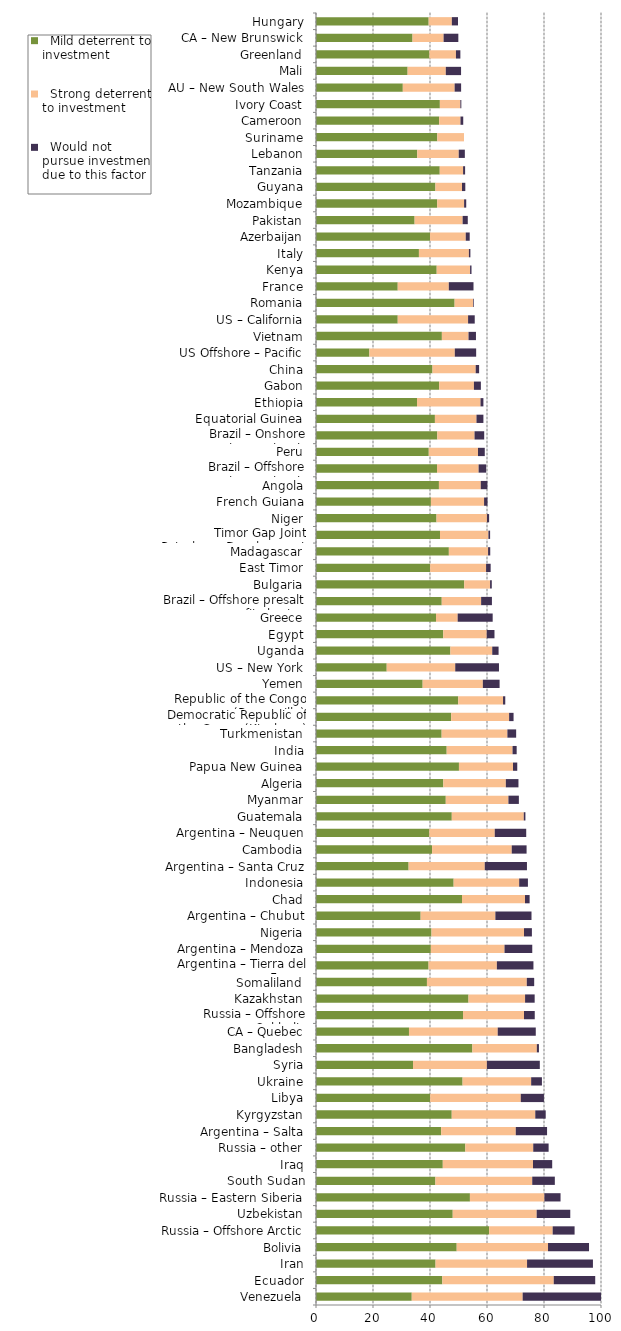
| Category |   Mild deterrent to investment |   Strong deterrent to investment |   Would not pursue investment due to this factor |
|---|---|---|---|
| Venezuela | 33.599 | 38.911 | 27.49 |
| Ecuador | 44.326 | 39.098 | 14.548 |
| Iran | 41.951 | 32.105 | 23.116 |
| Bolivia | 49.37 | 32.041 | 14.386 |
| Russia – Offshore Arctic | 60.746 | 22.299 | 7.689 |
| Uzbekistan | 47.976 | 29.459 | 11.783 |
| Russia – Eastern Siberia | 54.009 | 26.133 | 5.662 |
| South Sudan | 41.9 | 33.973 | 7.927 |
| Iraq | 44.489 | 31.651 | 6.737 |
| Russia – other | 52.391 | 23.834 | 5.396 |
| Argentina – Salta | 43.916 | 26.18 | 10.979 |
| Kyrgyzstan | 47.629 | 29.31 | 3.664 |
| Libya | 40.067 | 31.782 | 8.134 |
| Ukraine | 51.432 | 24.064 | 3.775 |
| Syria | 34.044 | 25.92 | 18.569 |
| Bangladesh | 54.869 | 22.615 | 0.741 |
| CA – Quebec | 32.625 | 31.142 | 13.347 |
| Russia – Offshore Sakhalin | 51.589 | 21.391 | 3.775 |
| Kazakhstan | 53.513 | 19.846 | 3.367 |
| Somaliland | 38.928 | 35.035 | 2.595 |
| Argentina – Tierra del Fuego | 39.497 | 23.968 | 12.828 |
| Argentina – Mendoza | 40.292 | 25.854 | 9.737 |
| Nigeria | 40.525 | 32.466 | 2.763 |
| Argentina – Chubut | 36.715 | 26.225 | 12.675 |
| Chad | 51.229 | 22.11 | 1.618 |
| Indonesia | 48.299 | 22.99 | 3.07 |
| Argentina – Santa Cruz | 32.496 | 26.719 | 14.804 |
| Cambodia | 40.733 | 27.945 | 5.21 |
| Argentina – Neuquen | 39.771 | 22.951 | 11.038 |
| Guatemala | 47.646 | 25.258 | 0.574 |
| Myanmar | 45.536 | 21.983 | 3.664 |
| Algeria | 44.676 | 21.935 | 4.427 |
| Papua New Guinea | 50.157 | 18.974 | 1.485 |
| India | 45.856 | 23.108 | 1.444 |
| Turkmenistan | 44.086 | 23.068 | 3.076 |
| Democratic Republic of the Congo (Kinshasa) | 47.43 | 20.327 | 1.564 |
| Republic of the Congo (Brazzaville) | 49.906 | 15.718 | 0.786 |
| Yemen | 37.424 | 21.118 | 5.881 |
| US – New York | 24.811 | 24.044 | 15.347 |
| Uganda | 47.158 | 14.681 | 2.224 |
| Egypt | 44.654 | 15.248 | 2.723 |
| Greece | 42.108 | 7.603 | 12.281 |
| Brazil – Offshore presalt area profit sharing contracts | 44.123 | 13.816 | 3.788 |
| Bulgaria | 52.004 | 9.071 | 0.605 |
| East Timor | 40.054 | 19.627 | 1.602 |
| Madagascar | 46.618 | 13.756 | 0.764 |
| Timor Gap Joint Petroleum Development Area (JPDA) | 43.51 | 16.987 | 0.596 |
| Niger | 42.292 | 17.686 | 0.769 |
| French Guiana | 40.319 | 18.655 | 1.204 |
| Angola | 43.134 | 14.676 | 2.327 |
| Brazil – Offshore concession contracts | 42.463 | 14.597 | 2.654 |
| Peru | 39.572 | 17.278 | 2.369 |
| Brazil – Onshore concession contracts | 42.571 | 13.062 | 3.386 |
| Equatorial Guinea | 41.725 | 14.584 | 2.431 |
| Ethiopia | 35.446 | 22.281 | 1.013 |
| Gabon | 43.222 | 12.191 | 2.438 |
| China | 40.882 | 15.15 | 1.202 |
| US Offshore – Pacific | 18.732 | 29.971 | 7.493 |
| Vietnam | 44.167 | 9.354 | 2.605 |
| US – California | 28.682 | 24.68 | 2.335 |
| Romania | 48.636 | 6.452 | 0.248 |
| France | 28.678 | 17.924 | 8.663 |
| Kenya | 42.353 | 11.709 | 0.498 |
| Italy | 36.114 | 17.534 | 0.523 |
| Azerbaijan | 40.015 | 12.526 | 1.392 |
| Pakistan | 34.602 | 16.85 | 1.805 |
| Mozambique | 42.517 | 9.448 | 0.746 |
| Guyana | 41.911 | 9.314 | 1.164 |
| Tanzania | 43.421 | 8.186 | 0.712 |
| Lebanon | 35.53 | 14.554 | 2.14 |
| Suriname | 42.564 | 9.372 | 0 |
| Cameroon | 43.213 | 7.484 | 0.966 |
| Ivory Coast | 43.462 | 7.187 | 0.342 |
| AU – New South Wales | 30.46 | 18.185 | 2.273 |
| Mali | 32.147 | 13.394 | 5.358 |
| Greenland | 39.8 | 9.304 | 1.551 |
| CA – New Brunswick | 33.869 | 10.907 | 5.166 |
| Hungary | 39.537 | 8.124 | 2.166 |